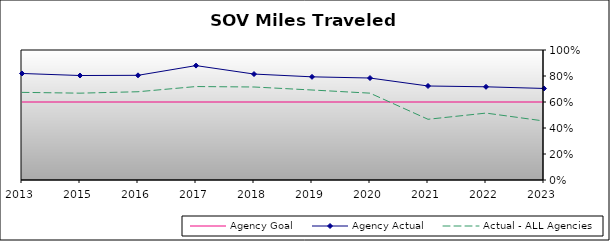
| Category | Agency Goal | Agency Actual | Actual - ALL Agencies |
|---|---|---|---|
| 2013.0 | 0.6 | 0.819 | 0.674 |
| 2015.0 | 0.6 | 0.804 | 0.668 |
| 2016.0 | 0.6 | 0.805 | 0.679 |
| 2017.0 | 0.6 | 0.88 | 0.719 |
| 2018.0 | 0.6 | 0.815 | 0.715 |
| 2019.0 | 0.6 | 0.794 | 0.692 |
| 2020.0 | 0.6 | 0.784 | 0.668 |
| 2021.0 | 0.6 | 0.723 | 0.467 |
| 2022.0 | 0.6 | 0.717 | 0.515 |
| 2023.0 | 0.6 | 0.704 | 0.454 |